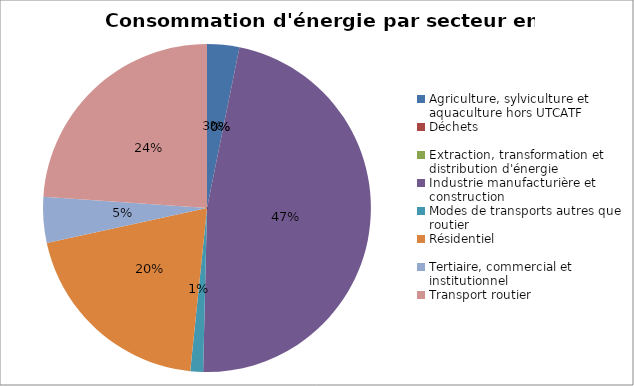
| Category | Series 0 |
|---|---|
| Agriculture, sylviculture et aquaculture hors UTCATF | 40547.91 |
| Déchets | 0 |
| Extraction, transformation et distribution d'énergie | 0 |
| Industrie manufacturière et construction | 603113.71 |
| Modes de transports autres que routier | 16064.53 |
| Résidentiel | 254968.32 |
| Tertiaire, commercial et institutionnel | 57559.8 |
| Transport routier | 305496.22 |